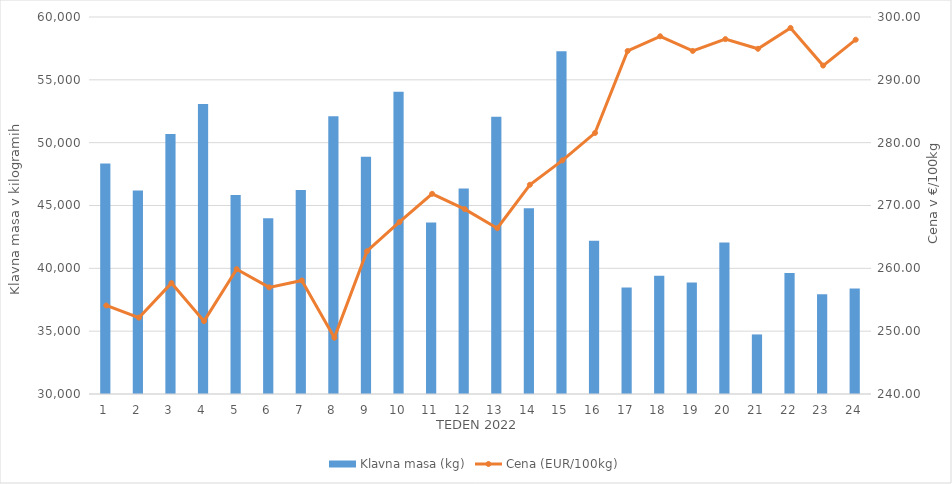
| Category | Klavna masa (kg) |
|---|---|
| 1.0 | 48349 |
| 2.0 | 46187 |
| 3.0 | 50692 |
| 4.0 | 53081 |
| 5.0 | 45844 |
| 6.0 | 43982 |
| 7.0 | 46227 |
| 8.0 | 52099 |
| 9.0 | 48872 |
| 10.0 | 54045 |
| 11.0 | 43645 |
| 12.0 | 46350 |
| 13.0 | 52061 |
| 14.0 | 44774 |
| 15.0 | 57268 |
| 16.0 | 42191 |
| 17.0 | 38469 |
| 18.0 | 39417 |
| 19.0 | 38876 |
| 20.0 | 42047 |
| 21.0 | 34739 |
| 22.0 | 39626 |
| 23.0 | 37939 |
| 24.0 | 38390 |